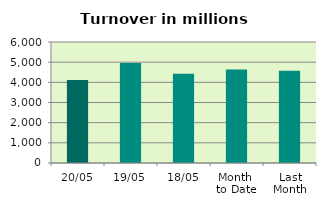
| Category | Series 0 |
|---|---|
| 20/05 | 4110.824 |
| 19/05 | 4957.925 |
| 18/05 | 4420.131 |
| Month 
to Date | 4642.308 |
| Last
Month | 4573.802 |